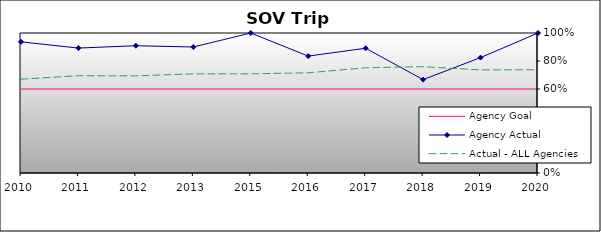
| Category | Agency Goal | Agency Actual | Actual - ALL Agencies |
|---|---|---|---|
| 2010.0 | 0.6 | 0.937 | 0.67 |
| 2011.0 | 0.6 | 0.892 | 0.695 |
| 2012.0 | 0.6 | 0.909 | 0.694 |
| 2013.0 | 0.6 | 0.9 | 0.708 |
| 2015.0 | 0.6 | 1 | 0.708 |
| 2016.0 | 0.6 | 0.835 | 0.716 |
| 2017.0 | 0.6 | 0.891 | 0.752 |
| 2018.0 | 0.6 | 0.667 | 0.759 |
| 2019.0 | 0.6 | 0.824 | 0.736 |
| 2020.0 | 0.6 | 1 | 0.737 |